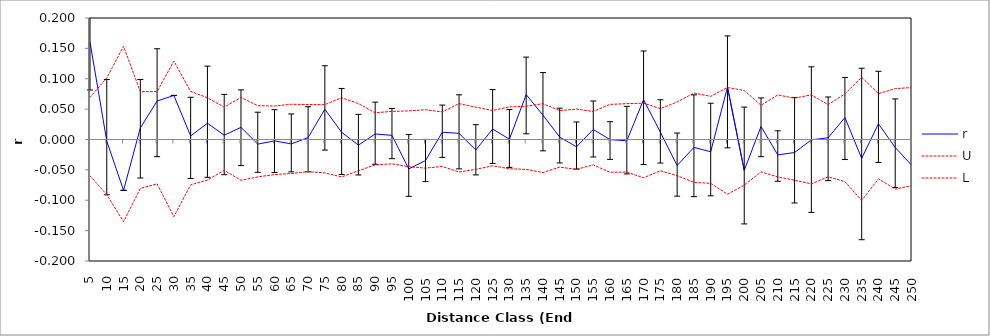
| Category | r | U | L |
|---|---|---|---|
| 5.0 | 0.16 | 0.069 | -0.06 |
| 10.0 | -0.003 | 0.102 | -0.091 |
| 15.0 | -0.084 | 0.153 | -0.135 |
| 20.0 | 0.019 | 0.079 | -0.081 |
| 25.0 | 0.063 | 0.079 | -0.073 |
| 30.0 | 0.073 | 0.129 | -0.127 |
| 35.0 | 0.006 | 0.079 | -0.075 |
| 40.0 | 0.027 | 0.069 | -0.067 |
| 45.0 | 0.007 | 0.053 | -0.051 |
| 50.0 | 0.02 | 0.069 | -0.067 |
| 55.0 | -0.008 | 0.056 | -0.062 |
| 60.0 | -0.002 | 0.055 | -0.058 |
| 65.0 | -0.007 | 0.058 | -0.056 |
| 70.0 | 0.003 | 0.058 | -0.053 |
| 75.0 | 0.05 | 0.057 | -0.055 |
| 80.0 | 0.012 | 0.069 | -0.062 |
| 85.0 | -0.009 | 0.059 | -0.052 |
| 90.0 | 0.009 | 0.044 | -0.042 |
| 95.0 | 0.007 | 0.046 | -0.04 |
| 100.0 | -0.048 | 0.047 | -0.045 |
| 105.0 | -0.035 | 0.049 | -0.047 |
| 110.0 | 0.012 | 0.045 | -0.044 |
| 115.0 | 0.01 | 0.059 | -0.053 |
| 120.0 | -0.017 | 0.053 | -0.049 |
| 125.0 | 0.017 | 0.048 | -0.043 |
| 130.0 | 0.001 | 0.054 | -0.048 |
| 135.0 | 0.074 | 0.055 | -0.049 |
| 140.0 | 0.04 | 0.059 | -0.054 |
| 145.0 | 0.004 | 0.048 | -0.045 |
| 150.0 | -0.012 | 0.05 | -0.049 |
| 155.0 | 0.017 | 0.046 | -0.042 |
| 160.0 | 0 | 0.058 | -0.054 |
| 165.0 | -0.002 | 0.059 | -0.054 |
| 170.0 | 0.066 | 0.06 | -0.063 |
| 175.0 | 0.012 | 0.051 | -0.051 |
| 180.0 | -0.043 | 0.062 | -0.06 |
| 185.0 | -0.013 | 0.077 | -0.071 |
| 190.0 | -0.02 | 0.071 | -0.072 |
| 195.0 | 0.086 | 0.086 | -0.09 |
| 200.0 | -0.051 | 0.081 | -0.075 |
| 205.0 | 0.021 | 0.056 | -0.053 |
| 210.0 | -0.025 | 0.073 | -0.062 |
| 215.0 | -0.021 | 0.068 | -0.067 |
| 220.0 | -0.001 | 0.074 | -0.073 |
| 225.0 | 0.003 | 0.057 | -0.061 |
| 230.0 | 0.036 | 0.075 | -0.069 |
| 235.0 | -0.031 | 0.102 | -0.1 |
| 240.0 | 0.026 | 0.075 | -0.065 |
| 245.0 | -0.013 | 0.084 | -0.082 |
| 250.0 | -0.043 | 0.086 | -0.076 |